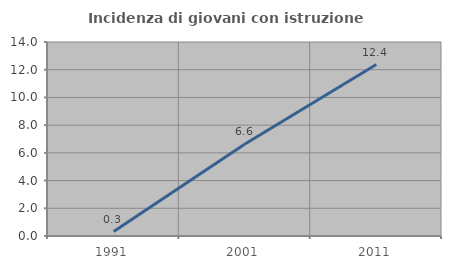
| Category | Incidenza di giovani con istruzione universitaria |
|---|---|
| 1991.0 | 0.322 |
| 2001.0 | 6.643 |
| 2011.0 | 12.371 |